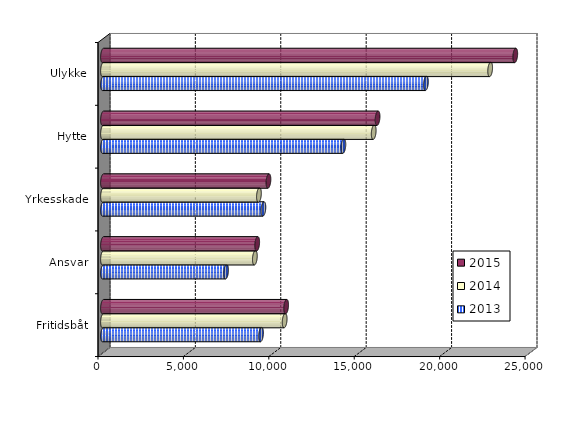
| Category | 2013 | 2014 | 2015 |
|---|---|---|---|
| Fritidsbåt | 9251 | 10634 | 10720.655 |
| Ansvar | 7206 | 8890 | 9026 |
| Yrkesskade | 9389 | 9129 | 9685 |
| Hytte | 14071 | 15847 | 16072.498 |
| Ulykke | 18904 | 22664 | 24133 |